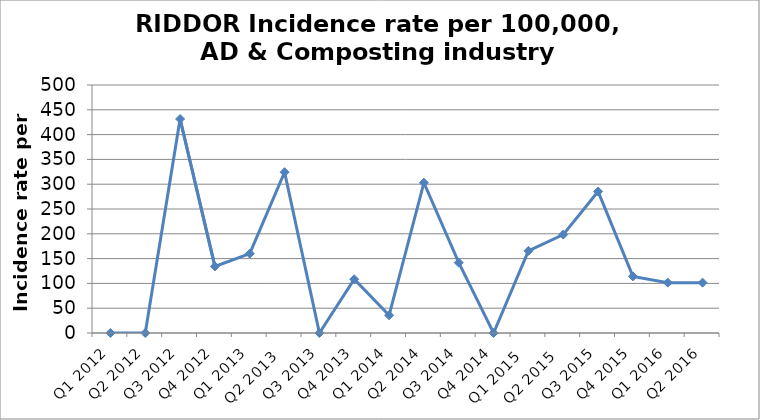
| Category | Series 0 |
|---|---|
| Q1 2012 | 0 |
| Q2 2012 | 0 |
| Q3 2012 | 431.499 |
| Q4 2012 | 134.228 |
| Q1 2013 | 160 |
| Q2 2013  | 324.149 |
| Q3 2013 | 0 |
| Q4 2013 | 108.342 |
| Q1 2014 | 35.727 |
| Q2 2014 | 303.03 |
| Q3 2014 | 141.844 |
| Q4 2014 | 0 |
| Q1 2015  | 165.563 |
| Q2 2015  | 198.413 |
| Q3 2015 | 285.307 |
| Q4 2015 | 114.155 |
| Q1 2016 | 101.523 |
| Q2 2016 | 101.523 |